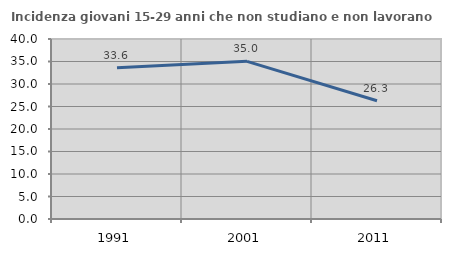
| Category | Incidenza giovani 15-29 anni che non studiano e non lavorano  |
|---|---|
| 1991.0 | 33.622 |
| 2001.0 | 35.04 |
| 2011.0 | 26.289 |